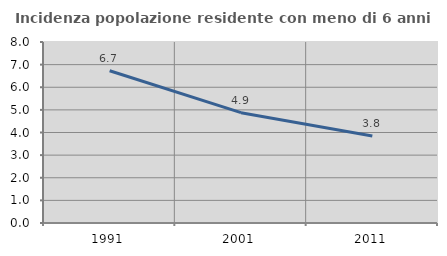
| Category | Incidenza popolazione residente con meno di 6 anni |
|---|---|
| 1991.0 | 6.727 |
| 2001.0 | 4.877 |
| 2011.0 | 3.846 |